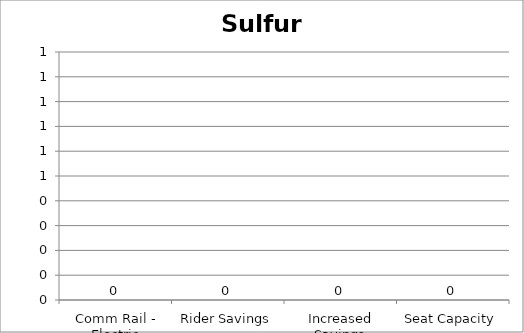
| Category | Sulfur Oxides |
|---|---|
| Comm Rail - Electric | 0 |
| Rider Savings | 0 |
| Increased Savings | 0 |
| Seat Capacity | 0 |